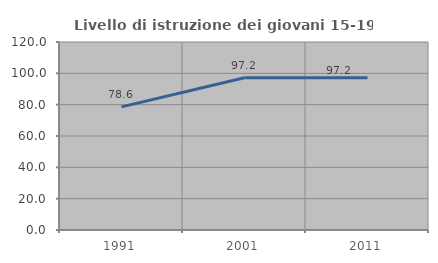
| Category | Livello di istruzione dei giovani 15-19 anni |
|---|---|
| 1991.0 | 78.579 |
| 2001.0 | 97.23 |
| 2011.0 | 97.203 |